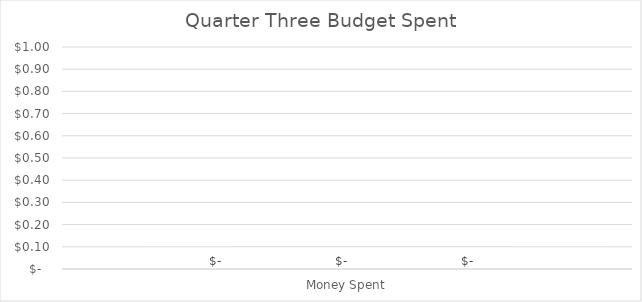
| Category | July Budget | August Budget | September Budget |
|---|---|---|---|
| 0 | 0 | 0 | 0 |